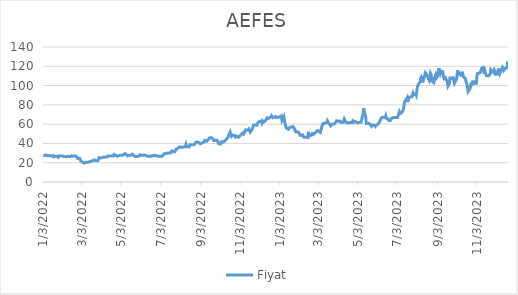
| Category | Fiyat |
|---|---|
| 12/20/23 | 125.1 |
| 12/19/23 | 118.8 |
| 12/18/23 | 118.2 |
| 12/15/23 | 117.1 |
| 12/14/23 | 115.9 |
| 12/13/23 | 117.8 |
| 12/12/23 | 119 |
| 12/11/23 | 118.7 |
| 12/8/23 | 112.5 |
| 12/7/23 | 115.2 |
| 12/6/23 | 117.6 |
| 12/5/23 | 114.5 |
| 12/4/23 | 111.7 |
| 12/1/23 | 111.7 |
| 11/30/23 | 114.7 |
| 11/29/23 | 116.5 |
| 11/28/23 | 115.3 |
| 11/27/23 | 114.1 |
| 11/24/23 | 116.4 |
| 11/23/23 | 112.1 |
| 11/22/23 | 111 |
| 11/21/23 | 111.3 |
| 11/20/23 | 110 |
| 11/17/23 | 110.4 |
| 11/16/23 | 110.9 |
| 11/15/23 | 114.8 |
| 11/14/23 | 112 |
| 11/13/23 | 118.9 |
| 11/10/23 | 118.2 |
| 11/9/23 | 115.4 |
| 11/8/23 | 113.9 |
| 11/7/23 | 113 |
| 11/6/23 | 112.8 |
| 11/3/23 | 112.4 |
| 11/2/23 | 104 |
| 11/1/23 | 101.1 |
| 10/31/23 | 104 |
| 10/30/23 | 103.9 |
| 10/27/23 | 104 |
| 10/26/23 | 100 |
| 10/25/23 | 103 |
| 10/24/23 | 99.7 |
| 10/23/23 | 97.2 |
| 10/20/23 | 94 |
| 10/19/23 | 98.55 |
| 10/18/23 | 101.8 |
| 10/17/23 | 103.2 |
| 10/16/23 | 107 |
| 10/13/23 | 109 |
| 10/12/23 | 111.5 |
| 10/11/23 | 114.4 |
| 10/10/23 | 109.6 |
| 10/9/23 | 111.9 |
| 10/6/23 | 112.6 |
| 10/5/23 | 110.8 |
| 10/4/23 | 115.7 |
| 10/3/23 | 110.3 |
| 10/2/23 | 106.5 |
| 9/29/23 | 102.5 |
| 9/28/23 | 105.3 |
| 9/27/23 | 109.2 |
| 9/26/23 | 107.1 |
| 9/25/23 | 106.7 |
| 9/22/23 | 107.8 |
| 9/21/23 | 101.9 |
| 9/20/23 | 102.5 |
| 9/19/23 | 99.5 |
| 9/18/23 | 103.8 |
| 9/15/23 | 108.09 |
| 9/14/23 | 107.39 |
| 9/13/23 | 107.1 |
| 9/12/23 | 108.48 |
| 9/11/23 | 114.32 |
| 9/8/23 | 115.1 |
| 9/7/23 | 112.7 |
| 9/6/23 | 115 |
| 9/5/23 | 118 |
| 9/4/23 | 110.5 |
| 9/1/23 | 107.9 |
| 8/31/23 | 111.1 |
| 8/29/23 | 107.6 |
| 8/28/23 | 103 |
| 8/25/23 | 104.8 |
| 8/24/23 | 111.4 |
| 8/23/23 | 112.8 |
| 8/22/23 | 108.1 |
| 8/21/23 | 105.4 |
| 8/18/23 | 110.1 |
| 8/17/23 | 111.5 |
| 8/16/23 | 111.5 |
| 8/15/23 | 113.3 |
| 8/14/23 | 110.5 |
| 8/11/23 | 103.3 |
| 8/10/23 | 107.7 |
| 8/9/23 | 109 |
| 8/8/23 | 107.7 |
| 8/7/23 | 103.5 |
| 8/4/23 | 101.1 |
| 8/3/23 | 99 |
| 8/2/23 | 95.1 |
| 8/1/23 | 90.05 |
| 7/31/23 | 91.5 |
| 7/28/23 | 90.3 |
| 7/27/23 | 92.1 |
| 7/26/23 | 91.55 |
| 7/25/23 | 88.4 |
| 7/24/23 | 89.4 |
| 7/21/23 | 88.05 |
| 7/20/23 | 88.6 |
| 7/19/23 | 82.95 |
| 7/18/23 | 87.45 |
| 7/17/23 | 87 |
| 7/14/23 | 82.95 |
| 7/13/23 | 78.8 |
| 7/12/23 | 75 |
| 7/11/23 | 74.05 |
| 7/10/23 | 72.05 |
| 7/7/23 | 71 |
| 7/6/23 | 72.65 |
| 7/5/23 | 71.65 |
| 7/4/23 | 68.5 |
| 7/3/23 | 66.8 |
| 6/27/23 | 66.9 |
| 6/26/23 | 66.15 |
| 6/23/23 | 65.6 |
| 6/22/23 | 63.8 |
| 6/21/23 | 64.55 |
| 6/20/23 | 63.85 |
| 6/19/23 | 64.85 |
| 6/16/23 | 66.5 |
| 6/15/23 | 68.7 |
| 6/14/23 | 66.65 |
| 6/13/23 | 67.05 |
| 6/12/23 | 67.15 |
| 6/9/23 | 66.85 |
| 6/8/23 | 66.5 |
| 6/7/23 | 65 |
| 6/6/23 | 64 |
| 6/5/23 | 61.5 |
| 6/2/23 | 59.3 |
| 6/1/23 | 58.65 |
| 5/31/23 | 59 |
| 5/30/23 | 57.85 |
| 5/29/23 | 58.95 |
| 5/26/23 | 59 |
| 5/25/23 | 59.1 |
| 5/24/23 | 57.7 |
| 5/23/23 | 58.3 |
| 5/22/23 | 60.15 |
| 5/18/23 | 60.98 |
| 5/17/23 | 61.23 |
| 5/16/23 | 60.78 |
| 5/15/23 | 67.51 |
| 5/12/23 | 76.35 |
| 5/11/23 | 69.82 |
| 5/10/23 | 68.54 |
| 5/9/23 | 64.81 |
| 5/8/23 | 61.91 |
| 5/5/23 | 61.91 |
| 5/4/23 | 61.62 |
| 5/3/23 | 61.28 |
| 5/2/23 | 61.77 |
| 4/28/23 | 62.99 |
| 4/27/23 | 62.6 |
| 4/26/23 | 61.86 |
| 4/25/23 | 62.99 |
| 4/24/23 | 61.72 |
| 4/20/23 | 61.82 |
| 4/19/23 | 62.11 |
| 4/18/23 | 61.23 |
| 4/17/23 | 61.57 |
| 4/14/23 | 62.11 |
| 4/13/23 | 63.73 |
| 4/12/23 | 65.2 |
| 4/11/23 | 63.04 |
| 4/10/23 | 61.86 |
| 4/7/23 | 61.82 |
| 4/6/23 | 62.7 |
| 4/5/23 | 63.34 |
| 4/4/23 | 62.75 |
| 4/3/23 | 62.9 |
| 3/31/23 | 63.53 |
| 3/30/23 | 63.63 |
| 3/29/23 | 61.18 |
| 3/28/23 | 62.16 |
| 3/27/23 | 60.05 |
| 3/24/23 | 59.9 |
| 3/23/23 | 59.9 |
| 3/22/23 | 58.23 |
| 3/21/23 | 58.13 |
| 3/20/23 | 60.24 |
| 3/17/23 | 63.53 |
| 3/16/23 | 61.37 |
| 3/15/23 | 61.86 |
| 3/14/23 | 61.32 |
| 3/13/23 | 61.42 |
| 3/10/23 | 60.39 |
| 3/9/23 | 58.62 |
| 3/8/23 | 56.02 |
| 3/7/23 | 56.96 |
| 3/6/23 | 51.41 |
| 3/3/23 | 53.03 |
| 3/2/23 | 53.03 |
| 3/1/23 | 53.08 |
| 2/28/23 | 52.44 |
| 2/27/23 | 51.51 |
| 2/24/23 | 49.59 |
| 2/23/23 | 49.69 |
| 2/22/23 | 50.33 |
| 2/21/23 | 48.8 |
| 2/20/23 | 49.02 |
| 2/17/23 | 48.02 |
| 2/16/23 | 52 |
| 2/15/23 | 46.07 |
| 2/8/23 | 46.68 |
| 2/7/23 | 48.8 |
| 2/6/23 | 49.2 |
| 2/3/23 | 48.39 |
| 2/2/23 | 48.63 |
| 2/1/23 | 51.26 |
| 1/31/23 | 51.51 |
| 1/30/23 | 51.8 |
| 1/27/23 | 52.24 |
| 1/26/23 | 54.25 |
| 1/25/23 | 55.68 |
| 1/24/23 | 55.68 |
| 1/23/23 | 57.45 |
| 1/20/23 | 56.96 |
| 1/19/23 | 56.61 |
| 1/18/23 | 56.76 |
| 1/17/23 | 56.07 |
| 1/16/23 | 54.7 |
| 1/13/23 | 55.78 |
| 1/12/23 | 55.53 |
| 1/11/23 | 59.36 |
| 1/10/23 | 62.9 |
| 1/9/23 | 67.66 |
| 1/6/23 | 63.83 |
| 1/5/23 | 68.54 |
| 1/4/23 | 68.05 |
| 1/3/23 | 67.56 |
| 1/2/23 | 66.73 |
| 12/30/22 | 67.07 |
| 12/29/22 | 66.33 |
| 12/28/22 | 66.77 |
| 12/27/22 | 67.9 |
| 12/26/22 | 67.86 |
| 12/23/22 | 66.63 |
| 12/22/22 | 67.17 |
| 12/21/22 | 68.74 |
| 12/20/22 | 67.56 |
| 12/19/22 | 67.95 |
| 12/16/22 | 65.79 |
| 12/15/22 | 65.3 |
| 12/14/22 | 66.53 |
| 12/13/22 | 66.33 |
| 12/12/22 | 64.12 |
| 12/9/22 | 62.21 |
| 12/8/22 | 61.72 |
| 12/7/22 | 63.53 |
| 12/6/22 | 61.37 |
| 12/5/22 | 63.09 |
| 12/2/22 | 62.75 |
| 12/1/22 | 63.44 |
| 11/30/22 | 61.57 |
| 11/29/22 | 61.77 |
| 11/28/22 | 58.87 |
| 11/25/22 | 59.36 |
| 11/24/22 | 60.39 |
| 11/23/22 | 58.72 |
| 11/22/22 | 57.69 |
| 11/21/22 | 54.5 |
| 11/18/22 | 51.8 |
| 11/17/22 | 53.62 |
| 11/16/22 | 54.89 |
| 11/15/22 | 53.81 |
| 11/14/22 | 53.03 |
| 11/11/22 | 54.11 |
| 11/10/22 | 52.24 |
| 11/9/22 | 52.83 |
| 11/8/22 | 49.98 |
| 11/7/22 | 51.06 |
| 11/4/22 | 49.25 |
| 11/3/22 | 48.31 |
| 11/2/22 | 47.69 |
| 11/1/22 | 47.33 |
| 10/31/22 | 46.35 |
| 10/28/22 | 47.61 |
| 10/27/22 | 47.63 |
| 10/26/22 | 46.68 |
| 10/25/22 | 48.12 |
| 10/24/22 | 47.63 |
| 10/21/22 | 48.69 |
| 10/20/22 | 47.53 |
| 10/19/22 | 48.92 |
| 10/18/22 | 51.75 |
| 10/17/22 | 50.33 |
| 10/14/22 | 45.41 |
| 10/13/22 | 45.94 |
| 10/12/22 | 44.48 |
| 10/11/22 | 44.27 |
| 10/10/22 | 42.48 |
| 10/7/22 | 41.4 |
| 10/6/22 | 41.99 |
| 10/5/22 | 41.81 |
| 10/4/22 | 41.75 |
| 10/3/22 | 39.34 |
| 9/30/22 | 40.06 |
| 9/29/22 | 42.23 |
| 9/28/22 | 42.78 |
| 9/27/22 | 43.36 |
| 9/26/22 | 43.52 |
| 9/23/22 | 43.01 |
| 9/22/22 | 43.03 |
| 9/21/22 | 45.17 |
| 9/20/22 | 44.58 |
| 9/19/22 | 46 |
| 9/16/22 | 45.64 |
| 9/15/22 | 45.82 |
| 9/14/22 | 43.89 |
| 9/13/22 | 43.78 |
| 9/12/22 | 42.34 |
| 9/9/22 | 43.19 |
| 9/8/22 | 41.6 |
| 9/7/22 | 41.03 |
| 9/6/22 | 40.85 |
| 9/5/22 | 40.16 |
| 9/2/22 | 39.63 |
| 9/1/22 | 40.52 |
| 8/31/22 | 40.75 |
| 8/29/22 | 41.6 |
| 8/26/22 | 41.18 |
| 8/25/22 | 39.75 |
| 8/24/22 | 40.5 |
| 8/23/22 | 38.57 |
| 8/22/22 | 38.14 |
| 8/19/22 | 38.65 |
| 8/18/22 | 39.48 |
| 8/17/22 | 38.69 |
| 8/16/22 | 36.39 |
| 8/15/22 | 36.82 |
| 8/12/22 | 36.67 |
| 8/11/22 | 38.98 |
| 8/10/22 | 36.63 |
| 8/9/22 | 35.78 |
| 8/8/22 | 36.31 |
| 8/5/22 | 36 |
| 8/4/22 | 35.08 |
| 8/3/22 | 35.88 |
| 8/2/22 | 36.49 |
| 8/1/22 | 36.43 |
| 7/29/22 | 34.72 |
| 7/28/22 | 34.49 |
| 7/27/22 | 34.17 |
| 7/26/22 | 33.33 |
| 7/25/22 | 31.38 |
| 7/22/22 | 31.7 |
| 7/21/22 | 31.88 |
| 7/20/22 | 32.21 |
| 7/19/22 | 31.42 |
| 7/18/22 | 30.05 |
| 7/14/22 | 30.03 |
| 7/13/22 | 30.13 |
| 7/8/22 | 29.2 |
| 7/7/22 | 28.5 |
| 7/6/22 | 27 |
| 7/5/22 | 26.71 |
| 7/4/22 | 26.57 |
| 7/1/22 | 26.61 |
| 6/30/22 | 26.02 |
| 6/29/22 | 26.91 |
| 6/28/22 | 26.91 |
| 6/27/22 | 26.91 |
| 6/24/22 | 27.69 |
| 6/23/22 | 27.63 |
| 6/22/22 | 27 |
| 6/21/22 | 27.02 |
| 6/20/22 | 27.34 |
| 6/17/22 | 26.49 |
| 6/16/22 | 27.04 |
| 6/15/22 | 26.73 |
| 6/14/22 | 26.51 |
| 6/13/22 | 26.81 |
| 6/10/22 | 27.36 |
| 6/9/22 | 26.61 |
| 6/8/22 | 28.1 |
| 6/7/22 | 28.24 |
| 6/6/22 | 27.91 |
| 6/3/22 | 27.71 |
| 6/2/22 | 27.85 |
| 6/1/22 | 28.18 |
| 5/31/22 | 28.54 |
| 5/30/22 | 26.61 |
| 5/27/22 | 26.57 |
| 5/26/22 | 26.43 |
| 5/25/22 | 26.38 |
| 5/24/22 | 26.32 |
| 5/23/22 | 27.04 |
| 5/20/22 | 28.97 |
| 5/18/22 | 27.97 |
| 5/17/22 | 28.32 |
| 5/16/22 | 27.69 |
| 5/13/22 | 27.04 |
| 5/12/22 | 27.82 |
| 5/11/22 | 28.33 |
| 5/10/22 | 28.76 |
| 5/9/22 | 29.46 |
| 5/6/22 | 28.02 |
| 5/5/22 | 27.39 |
| 4/29/22 | 27.32 |
| 4/28/22 | 26.73 |
| 4/27/22 | 26.71 |
| 4/26/22 | 27.56 |
| 4/25/22 | 27.6 |
| 4/22/22 | 28.57 |
| 4/21/22 | 26.95 |
| 4/20/22 | 26.92 |
| 4/19/22 | 27.19 |
| 4/18/22 | 27.21 |
| 4/15/22 | 26.88 |
| 4/14/22 | 26.84 |
| 4/13/22 | 27.16 |
| 4/12/22 | 27.08 |
| 4/11/22 | 25.99 |
| 4/8/22 | 25.72 |
| 4/7/22 | 25.68 |
| 4/6/22 | 25.83 |
| 4/5/22 | 26.05 |
| 4/4/22 | 25.46 |
| 4/1/22 | 24.76 |
| 3/31/22 | 25.15 |
| 3/30/22 | 25.26 |
| 3/29/22 | 23.23 |
| 3/28/22 | 22.03 |
| 3/25/22 | 22.14 |
| 3/24/22 | 22.55 |
| 3/23/22 | 22.8 |
| 3/22/22 | 22.51 |
| 3/21/22 | 22.31 |
| 3/18/22 | 21.68 |
| 3/17/22 | 21.53 |
| 3/16/22 | 21.22 |
| 3/15/22 | 20.68 |
| 3/14/22 | 20.67 |
| 3/11/22 | 20.33 |
| 3/10/22 | 20.91 |
| 3/9/22 | 20.43 |
| 3/8/22 | 20.32 |
| 3/7/22 | 19.62 |
| 3/4/22 | 20.74 |
| 3/3/22 | 21.03 |
| 3/2/22 | 21.72 |
| 3/1/22 | 22.29 |
| 2/28/22 | 24.63 |
| 2/25/22 | 24.35 |
| 2/24/22 | 24.8 |
| 2/23/22 | 26.45 |
| 2/22/22 | 26.68 |
| 2/21/22 | 27.19 |
| 2/18/22 | 26.68 |
| 2/17/22 | 27.17 |
| 2/16/22 | 27.28 |
| 2/15/22 | 26.71 |
| 2/14/22 | 26.36 |
| 2/11/22 | 26.45 |
| 2/10/22 | 27.1 |
| 2/9/22 | 26.62 |
| 2/8/22 | 26.31 |
| 2/7/22 | 25.98 |
| 2/4/22 | 26.53 |
| 2/3/22 | 26.8 |
| 2/2/22 | 27.04 |
| 2/1/22 | 26.88 |
| 1/31/22 | 27.01 |
| 1/28/22 | 27.25 |
| 1/27/22 | 26.23 |
| 1/26/22 | 25.55 |
| 1/25/22 | 25.75 |
| 1/24/22 | 26.68 |
| 1/21/22 | 26.69 |
| 1/20/22 | 26.95 |
| 1/19/22 | 26.18 |
| 1/18/22 | 27.43 |
| 1/17/22 | 27.6 |
| 1/14/22 | 26.99 |
| 1/13/22 | 26.8 |
| 1/12/22 | 27.54 |
| 1/11/22 | 27.49 |
| 1/10/22 | 27.12 |
| 1/7/22 | 28 |
| 1/6/22 | 27.86 |
| 1/5/22 | 27.51 |
| 1/4/22 | 28.08 |
| 1/3/22 | 27.87 |